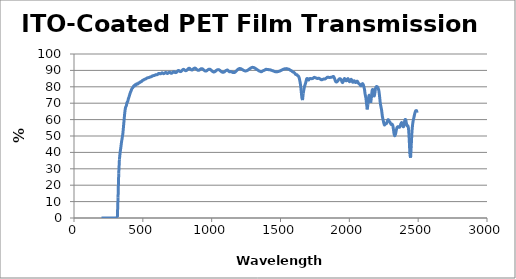
| Category | % Transmission |
|---|---|
| 200.0 | 0.005 |
| 205.0 | 0 |
| 210.0 | 0.003 |
| 215.0 | 0.001 |
| 220.0 | -0.002 |
| 225.0 | 0.007 |
| 230.0 | -0.001 |
| 235.0 | 0.005 |
| 240.0 | 0.001 |
| 245.0 | 0 |
| 250.0 | 0.005 |
| 255.0 | 0.006 |
| 260.0 | 0.007 |
| 265.0 | 0.003 |
| 270.0 | 0.001 |
| 275.0 | 0.006 |
| 280.0 | -0.001 |
| 285.0 | 0.002 |
| 290.0 | 0.007 |
| 295.0 | 0.002 |
| 300.0 | 0.003 |
| 305.0 | 0.002 |
| 310.0 | 0.007 |
| 315.0 | 0.607 |
| 320.0 | 12.654 |
| 325.0 | 27.27 |
| 330.0 | 35.737 |
| 335.0 | 39.854 |
| 340.0 | 42.911 |
| 345.0 | 46.21 |
| 350.0 | 48.823 |
| 355.0 | 51.556 |
| 360.0 | 56.155 |
| 365.0 | 60.851 |
| 370.0 | 65.075 |
| 375.0 | 67.554 |
| 380.0 | 68.374 |
| 385.0 | 70.433 |
| 390.0 | 70.964 |
| 395.0 | 72.697 |
| 400.0 | 73.893 |
| 405.0 | 75.338 |
| 410.0 | 76.707 |
| 415.0 | 77.578 |
| 420.0 | 78.749 |
| 425.0 | 79.296 |
| 430.0 | 79.852 |
| 435.0 | 80.619 |
| 440.0 | 80.553 |
| 445.0 | 81.283 |
| 450.0 | 81.045 |
| 455.0 | 81.772 |
| 460.0 | 81.675 |
| 465.0 | 81.84 |
| 470.0 | 82.4 |
| 475.0 | 82.434 |
| 480.0 | 82.884 |
| 485.0 | 83.135 |
| 490.0 | 83.156 |
| 495.0 | 83.724 |
| 500.0 | 84.009 |
| 505.0 | 84.119 |
| 510.0 | 84.486 |
| 515.0 | 84.663 |
| 520.0 | 84.748 |
| 525.0 | 85.051 |
| 530.0 | 85.325 |
| 535.0 | 85.481 |
| 540.0 | 85.593 |
| 545.0 | 85.674 |
| 550.0 | 85.861 |
| 555.0 | 86.021 |
| 560.0 | 86.141 |
| 565.0 | 86.339 |
| 570.0 | 86.67 |
| 575.0 | 86.811 |
| 580.0 | 86.805 |
| 585.0 | 86.901 |
| 590.0 | 87.239 |
| 595.0 | 87.4 |
| 600.0 | 87.361 |
| 605.0 | 87.405 |
| 610.0 | 87.808 |
| 615.0 | 88.135 |
| 620.0 | 88.106 |
| 625.0 | 87.911 |
| 630.0 | 87.975 |
| 635.0 | 88.306 |
| 640.0 | 88.525 |
| 645.0 | 88.298 |
| 650.0 | 88.02 |
| 655.0 | 88.107 |
| 660.0 | 88.447 |
| 665.0 | 88.73 |
| 670.0 | 88.643 |
| 675.0 | 88.27 |
| 680.0 | 88.116 |
| 685.0 | 88.468 |
| 690.0 | 88.775 |
| 695.0 | 88.919 |
| 700.0 | 88.615 |
| 705.0 | 88.269 |
| 710.0 | 88.27 |
| 715.0 | 88.575 |
| 720.0 | 89.034 |
| 725.0 | 89.21 |
| 730.0 | 89.047 |
| 735.0 | 88.693 |
| 740.0 | 88.653 |
| 745.0 | 88.88 |
| 750.0 | 89.384 |
| 755.0 | 89.819 |
| 760.0 | 89.925 |
| 765.0 | 89.669 |
| 770.0 | 89.368 |
| 775.0 | 89.246 |
| 780.0 | 89.519 |
| 785.0 | 90.015 |
| 790.0 | 90.447 |
| 795.0 | 90.661 |
| 800.0 | 90.462 |
| 805.0 | 90.128 |
| 810.0 | 89.851 |
| 815.0 | 89.894 |
| 820.0 | 90.159 |
| 825.0 | 90.638 |
| 830.0 | 91.086 |
| 835.0 | 91.307 |
| 840.0 | 91.209 |
| 845.0 | 90.81 |
| 850.0 | 90.445 |
| 855.0 | 90.277 |
| 860.0 | 90.311 |
| 865.0 | 90.806 |
| 870.0 | 91.138 |
| 875.0 | 91.37 |
| 880.0 | 91.38 |
| 885.0 | 91.139 |
| 890.0 | 90.757 |
| 895.0 | 90.367 |
| 900.0 | 90.092 |
| 905.0 | 90.028 |
| 910.0 | 90.198 |
| 915.0 | 90.522 |
| 920.0 | 90.846 |
| 925.0 | 91.053 |
| 930.0 | 91.061 |
| 935.0 | 90.852 |
| 940.0 | 90.498 |
| 945.0 | 90.089 |
| 950.0 | 89.765 |
| 955.0 | 89.609 |
| 960.0 | 89.639 |
| 965.0 | 89.86 |
| 970.0 | 90.197 |
| 975.0 | 90.518 |
| 980.0 | 90.73 |
| 985.0 | 90.754 |
| 990.0 | 90.578 |
| 995.0 | 90.258 |
| 1000.0 | 89.866 |
| 1005.0 | 89.473 |
| 1010.0 | 89.156 |
| 1015.0 | 89.028 |
| 1020.0 | 89.103 |
| 1025.0 | 89.345 |
| 1030.0 | 89.675 |
| 1035.0 | 90.03 |
| 1040.0 | 90.308 |
| 1045.0 | 90.457 |
| 1050.0 | 90.453 |
| 1055.0 | 90.276 |
| 1060.0 | 89.985 |
| 1065.0 | 89.634 |
| 1070.0 | 89.278 |
| 1075.0 | 88.992 |
| 1080.0 | 88.863 |
| 1085.0 | 88.891 |
| 1090.0 | 89.015 |
| 1095.0 | 89.285 |
| 1100.0 | 89.678 |
| 1105.0 | 89.915 |
| 1110.0 | 90.158 |
| 1115.0 | 90.214 |
| 1120.0 | 89.873 |
| 1125.0 | 89.41 |
| 1130.0 | 89.139 |
| 1135.0 | 89.289 |
| 1140.0 | 89.257 |
| 1145.0 | 89.105 |
| 1150.0 | 88.885 |
| 1155.0 | 88.688 |
| 1160.0 | 88.66 |
| 1165.0 | 88.717 |
| 1170.0 | 88.948 |
| 1175.0 | 89.306 |
| 1180.0 | 89.722 |
| 1185.0 | 90.168 |
| 1190.0 | 90.56 |
| 1195.0 | 90.871 |
| 1200.0 | 91.079 |
| 1205.0 | 91.139 |
| 1210.0 | 91.057 |
| 1215.0 | 90.888 |
| 1220.0 | 90.652 |
| 1225.0 | 90.391 |
| 1230.0 | 90.135 |
| 1235.0 | 89.909 |
| 1240.0 | 89.747 |
| 1245.0 | 89.674 |
| 1250.0 | 89.697 |
| 1255.0 | 89.805 |
| 1260.0 | 90.018 |
| 1265.0 | 90.298 |
| 1270.0 | 90.617 |
| 1275.0 | 90.943 |
| 1280.0 | 91.235 |
| 1285.0 | 91.488 |
| 1290.0 | 91.699 |
| 1295.0 | 91.831 |
| 1300.0 | 91.849 |
| 1305.0 | 91.756 |
| 1310.0 | 91.564 |
| 1315.0 | 91.335 |
| 1320.0 | 91.059 |
| 1325.0 | 90.731 |
| 1330.0 | 90.469 |
| 1335.0 | 90.191 |
| 1340.0 | 89.911 |
| 1345.0 | 89.634 |
| 1350.0 | 89.462 |
| 1355.0 | 89.341 |
| 1360.0 | 89.187 |
| 1365.0 | 89.341 |
| 1370.0 | 89.65 |
| 1375.0 | 89.856 |
| 1380.0 | 89.989 |
| 1385.0 | 90.21 |
| 1390.0 | 90.481 |
| 1395.0 | 90.69 |
| 1400.0 | 90.554 |
| 1405.0 | 90.528 |
| 1410.0 | 90.545 |
| 1415.0 | 90.429 |
| 1420.0 | 90.433 |
| 1425.0 | 90.323 |
| 1430.0 | 90.219 |
| 1435.0 | 90.068 |
| 1440.0 | 89.884 |
| 1445.0 | 89.787 |
| 1450.0 | 89.561 |
| 1455.0 | 89.44 |
| 1460.0 | 89.227 |
| 1465.0 | 89.171 |
| 1470.0 | 89.098 |
| 1475.0 | 89.143 |
| 1480.0 | 89.234 |
| 1485.0 | 89.329 |
| 1490.0 | 89.489 |
| 1495.0 | 89.581 |
| 1500.0 | 89.811 |
| 1505.0 | 90.014 |
| 1510.0 | 90.246 |
| 1515.0 | 90.466 |
| 1520.0 | 90.672 |
| 1525.0 | 90.827 |
| 1530.0 | 90.968 |
| 1535.0 | 91.044 |
| 1540.0 | 91.059 |
| 1545.0 | 91.087 |
| 1550.0 | 90.972 |
| 1555.0 | 90.79 |
| 1560.0 | 90.723 |
| 1565.0 | 90.498 |
| 1570.0 | 90.15 |
| 1575.0 | 89.977 |
| 1580.0 | 89.769 |
| 1585.0 | 89.348 |
| 1590.0 | 89.037 |
| 1595.0 | 88.879 |
| 1600.0 | 88.625 |
| 1605.0 | 88.173 |
| 1610.0 | 87.547 |
| 1615.0 | 87.401 |
| 1620.0 | 87.359 |
| 1625.0 | 86.742 |
| 1630.0 | 86.482 |
| 1635.0 | 85.628 |
| 1640.0 | 83.782 |
| 1645.0 | 81.534 |
| 1650.0 | 77.671 |
| 1655.0 | 73.571 |
| 1660.0 | 71.881 |
| 1665.0 | 75.902 |
| 1670.0 | 78.374 |
| 1675.0 | 80.445 |
| 1680.0 | 81.627 |
| 1685.0 | 83.136 |
| 1690.0 | 84.85 |
| 1695.0 | 85.019 |
| 1700.0 | 84.381 |
| 1705.0 | 84.161 |
| 1710.0 | 84.858 |
| 1715.0 | 85.074 |
| 1720.0 | 85.061 |
| 1725.0 | 84.964 |
| 1730.0 | 84.988 |
| 1735.0 | 85.123 |
| 1740.0 | 85.471 |
| 1745.0 | 85.758 |
| 1750.0 | 85.613 |
| 1755.0 | 85.465 |
| 1760.0 | 85.345 |
| 1765.0 | 85.126 |
| 1770.0 | 85.091 |
| 1775.0 | 85.209 |
| 1780.0 | 85.182 |
| 1785.0 | 84.955 |
| 1790.0 | 84.631 |
| 1795.0 | 84.336 |
| 1800.0 | 84.25 |
| 1805.0 | 84.474 |
| 1810.0 | 84.635 |
| 1815.0 | 84.811 |
| 1820.0 | 84.787 |
| 1825.0 | 84.822 |
| 1830.0 | 85.14 |
| 1835.0 | 85.489 |
| 1840.0 | 85.841 |
| 1845.0 | 85.877 |
| 1850.0 | 85.729 |
| 1855.0 | 85.666 |
| 1860.0 | 85.705 |
| 1865.0 | 85.798 |
| 1870.0 | 85.839 |
| 1875.0 | 85.9 |
| 1880.0 | 86.219 |
| 1885.0 | 86.248 |
| 1890.0 | 85.628 |
| 1895.0 | 84.45 |
| 1900.0 | 83.337 |
| 1905.0 | 82.907 |
| 1910.0 | 83.05 |
| 1915.0 | 83.398 |
| 1920.0 | 84.087 |
| 1925.0 | 84.622 |
| 1930.0 | 84.933 |
| 1935.0 | 84.833 |
| 1940.0 | 84.247 |
| 1945.0 | 83.373 |
| 1950.0 | 82.532 |
| 1955.0 | 83.1 |
| 1960.0 | 84.489 |
| 1965.0 | 85.09 |
| 1970.0 | 84.576 |
| 1975.0 | 83.772 |
| 1980.0 | 83.756 |
| 1985.0 | 84.56 |
| 1990.0 | 85.004 |
| 1995.0 | 84.164 |
| 2000.0 | 83.2 |
| 2005.0 | 83.325 |
| 2010.0 | 84.298 |
| 2015.0 | 84.482 |
| 2020.0 | 83.443 |
| 2025.0 | 82.726 |
| 2030.0 | 83.206 |
| 2035.0 | 83.716 |
| 2040.0 | 83.223 |
| 2045.0 | 82.567 |
| 2050.0 | 82.827 |
| 2055.0 | 83.418 |
| 2060.0 | 83.187 |
| 2065.0 | 82.361 |
| 2070.0 | 81.871 |
| 2075.0 | 81.579 |
| 2080.0 | 80.922 |
| 2085.0 | 80.584 |
| 2090.0 | 81.172 |
| 2095.0 | 81.915 |
| 2100.0 | 81.548 |
| 2105.0 | 80.203 |
| 2110.0 | 78.394 |
| 2115.0 | 75.384 |
| 2120.0 | 73.331 |
| 2125.0 | 69.699 |
| 2130.0 | 66.173 |
| 2135.0 | 69.089 |
| 2140.0 | 73.465 |
| 2145.0 | 74.882 |
| 2150.0 | 72.645 |
| 2155.0 | 70.16 |
| 2160.0 | 73.17 |
| 2165.0 | 77.332 |
| 2170.0 | 78.321 |
| 2175.0 | 76.398 |
| 2180.0 | 74.357 |
| 2185.0 | 75.913 |
| 2190.0 | 78.923 |
| 2195.0 | 80.029 |
| 2200.0 | 80.131 |
| 2205.0 | 79.796 |
| 2210.0 | 78.984 |
| 2215.0 | 77.366 |
| 2220.0 | 73.935 |
| 2225.0 | 69.948 |
| 2230.0 | 67.737 |
| 2235.0 | 65.373 |
| 2240.0 | 62.009 |
| 2245.0 | 59.939 |
| 2250.0 | 58.097 |
| 2255.0 | 56.716 |
| 2260.0 | 57.168 |
| 2265.0 | 57.46 |
| 2270.0 | 57.624 |
| 2275.0 | 58.77 |
| 2280.0 | 59.856 |
| 2285.0 | 59.816 |
| 2290.0 | 58.941 |
| 2295.0 | 58.363 |
| 2300.0 | 57.487 |
| 2305.0 | 56.977 |
| 2310.0 | 57.242 |
| 2315.0 | 56.637 |
| 2320.0 | 54.315 |
| 2325.0 | 51.278 |
| 2330.0 | 50.061 |
| 2335.0 | 51.071 |
| 2340.0 | 53.029 |
| 2345.0 | 54.832 |
| 2350.0 | 55.576 |
| 2355.0 | 55.696 |
| 2360.0 | 55.379 |
| 2365.0 | 55.369 |
| 2370.0 | 56.391 |
| 2375.0 | 57.575 |
| 2380.0 | 58.218 |
| 2385.0 | 57.604 |
| 2390.0 | 55.805 |
| 2395.0 | 55.913 |
| 2400.0 | 58.299 |
| 2405.0 | 59.998 |
| 2410.0 | 59.712 |
| 2415.0 | 57.511 |
| 2420.0 | 56.201 |
| 2425.0 | 56.192 |
| 2430.0 | 54.366 |
| 2435.0 | 47.978 |
| 2440.0 | 38.616 |
| 2445.0 | 36.737 |
| 2450.0 | 44.469 |
| 2455.0 | 52.666 |
| 2460.0 | 57.209 |
| 2465.0 | 59.734 |
| 2470.0 | 61.638 |
| 2475.0 | 63.586 |
| 2480.0 | 65.028 |
| 2485.0 | 65.505 |
| 2490.0 | 65.328 |
| 2495.0 | 65.146 |
| 2500.0 | 65.271 |